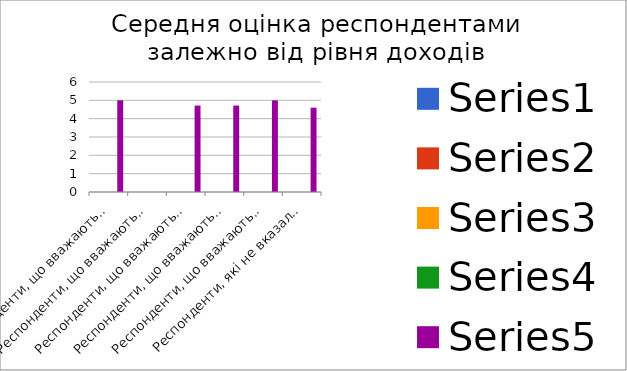
| Category | Series 0 | Series 1 | Series 2 | Series 3 | Series 4 |
|---|---|---|---|---|---|
| Респонденти, що вважають себе незаможними |  |  |  |  | 5 |
| Респонденти, що вважають своє матеріальне становище нижчим середнього |  |  |  |  | 0 |
| Респонденти, що вважають своє матеріальне становище середнім |  |  |  |  | 4.714 |
| Респонденти, що вважають своє матеріальне становище вищим середнього |  |  |  |  | 4.714 |
| Респонденти, що вважають себе заможними |  |  |  |  | 5 |
| Респонденти, які не вказали матеріальне становище своєї родини |  |  |  |  | 4.6 |